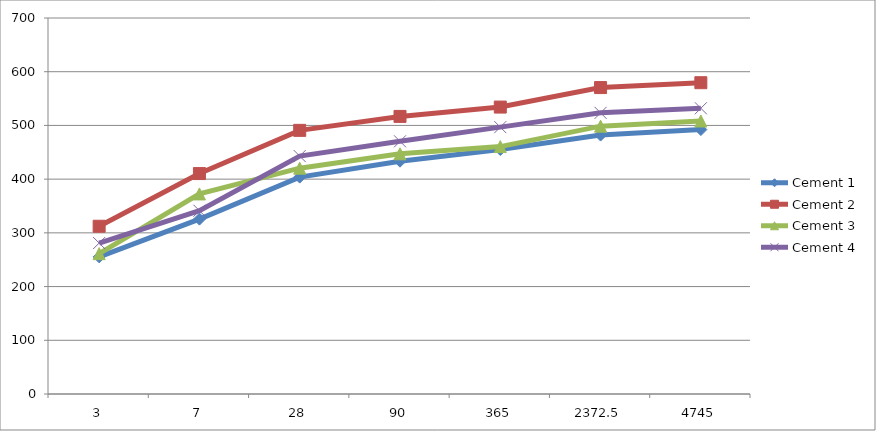
| Category | Cement 1 | Cement 2 | Cement 3 | Cement 4 |
|---|---|---|---|---|
| 3.0 | 255.261 | 312.28 | 261.29 | 281.01 |
| 7.0 | 325.588 | 410.38 | 372.47 | 341.19 |
| 28.0 | 403.801 | 490.83 | 420.41 | 442.93 |
| 90.0 | 433.426 | 516.8 | 447.21 | 470.41 |
| 365.0 | 455.209 | 534.17 | 460.63 | 496.83 |
| 2372.5 | 482.057 | 570.47 | 498.66 | 523.42 |
| 4745.0 | 492.23 | 579.53 | 508.26 | 531.94 |